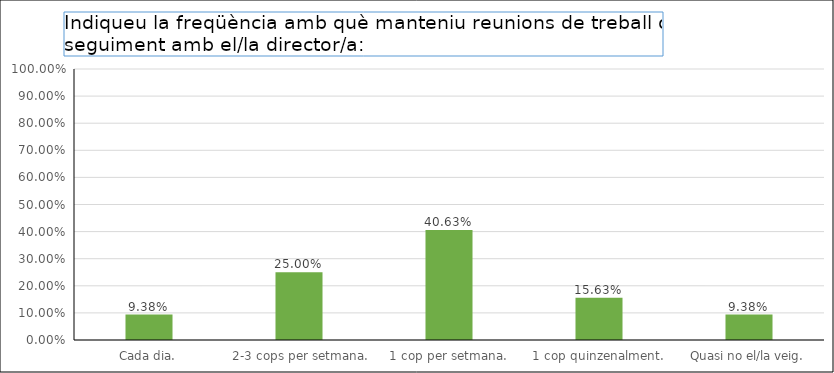
| Category | Series 0 |
|---|---|
| Cada dia. | 0.094 |
|  2-3 cops per setmana. | 0.25 |
| 1 cop per setmana. | 0.406 |
| 1 cop quinzenalment. | 0.156 |
| Quasi no el/la veig. | 0.094 |